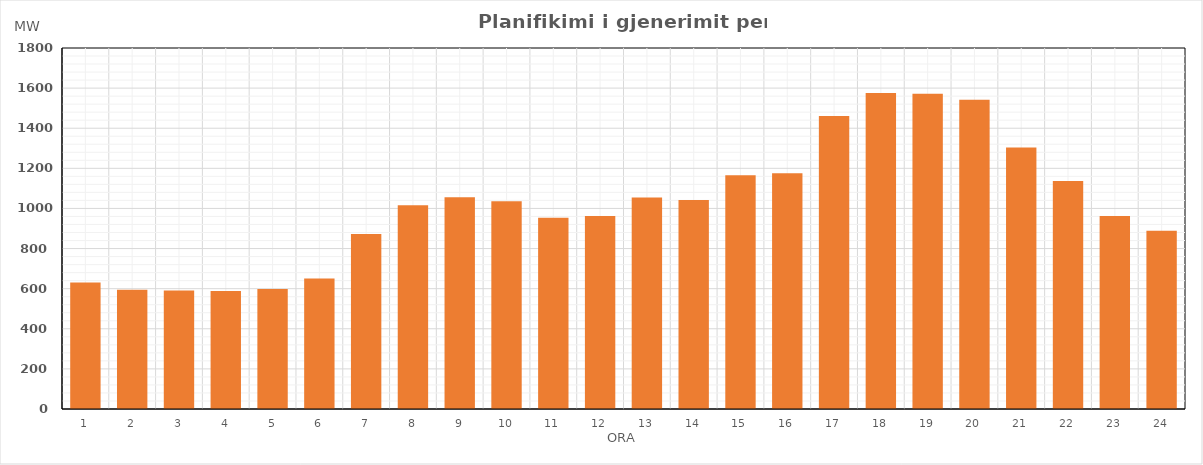
| Category | Max (MW) |
|---|---|
| 0 | 630.9 |
| 1 | 594.33 |
| 2 | 590.5 |
| 3 | 587.81 |
| 4 | 598.69 |
| 5 | 650.11 |
| 6 | 872.03 |
| 7 | 1015.43 |
| 8 | 1055.77 |
| 9 | 1036.32 |
| 10 | 953.53 |
| 11 | 962.61 |
| 12 | 1054.51 |
| 13 | 1042.26 |
| 14 | 1165.99 |
| 15 | 1175.26 |
| 16 | 1461.18 |
| 17 | 1575.39 |
| 18 | 1571.97 |
| 19 | 1541.82 |
| 20 | 1304.22 |
| 21 | 1137.27 |
| 22 | 962.9 |
| 23 | 888.91 |